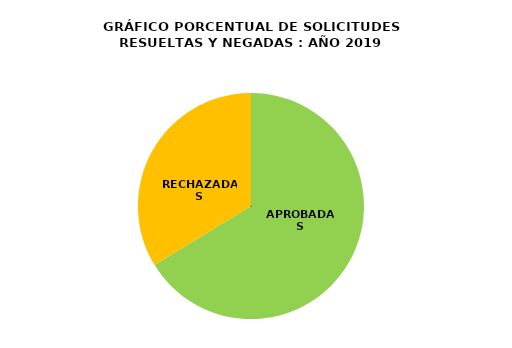
| Category | Series 0 |
|---|---|
| APROBADAS | 8950 |
| RECHAZADAS | 4561 |